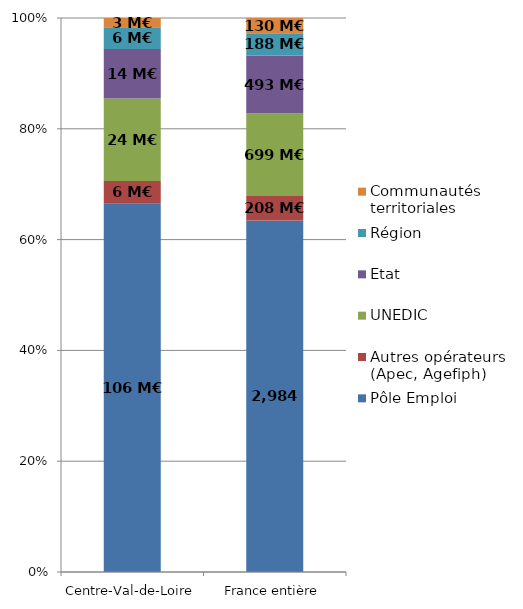
| Category | Pôle Emploi | Autres opérateurs (Apec, Agefiph) | UNEDIC | Etat | Région | Communautés territoriales |
|---|---|---|---|---|---|---|
| Centre-Val-de-Loire | 106.303 | 6.422 | 23.723 | 14.27 | 6.283 | 2.677 |
| France entière | 2983.694 | 207.577 | 699.479 | 493.308 | 188.079 | 129.71 |